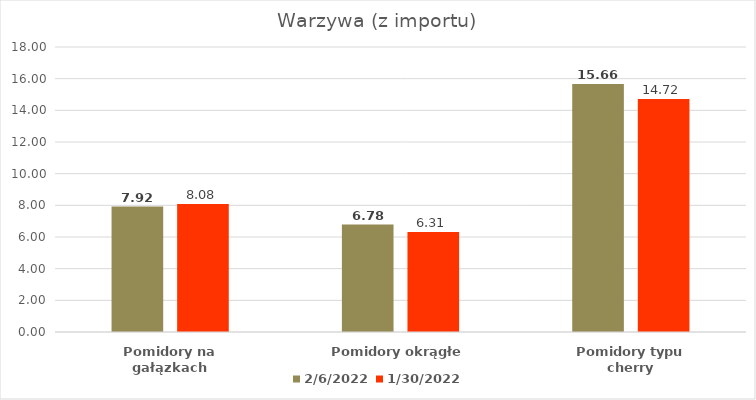
| Category | 2022-02-06 | 2022-01-30 |
|---|---|---|
| Pomidory na gałązkach | 7.924 | 8.08 |
| Pomidory okrągłe | 6.783 | 6.31 |
| Pomidory typu cherry | 15.659 | 14.72 |